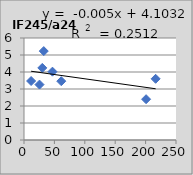
| Category | IF245/a245 |
|---|---|
| 25.5 | 3.26 |
| 61.3 | 3.46 |
| 11.7 | 3.47 |
| 216.5 | 3.6 |
| 46.8 | 4.02 |
| 32.5 | 5.23 |
| 200.8 | 2.4 |
| 30.1 | 4.24 |